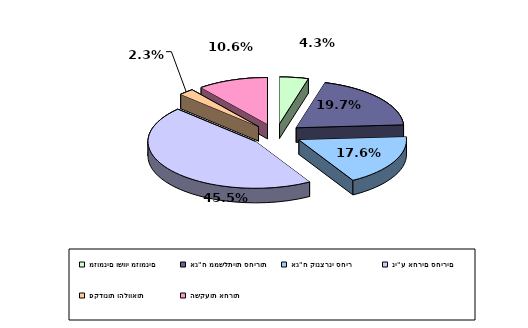
| Category | Series 0 |
|---|---|
| מזומנים ושווי מזומנים | 0.043 |
| אג"ח ממשלתיות סחירות | 0.197 |
| אג"ח קונצרני סחיר | 0.176 |
| ני"ע אחרים סחירים | 0.455 |
| פקדונות והלוואות | 0.023 |
| השקעות אחרות | 0.106 |